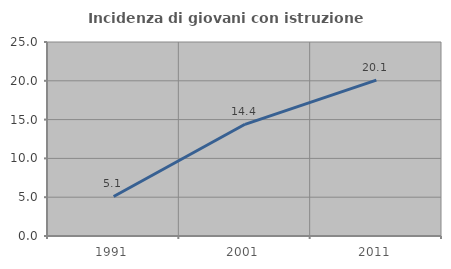
| Category | Incidenza di giovani con istruzione universitaria |
|---|---|
| 1991.0 | 5.091 |
| 2001.0 | 14.394 |
| 2011.0 | 20.091 |